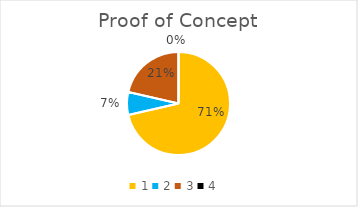
| Category | Series 0 |
|---|---|
| 0 | 0.714 |
| 1 | 0.071 |
| 2 | 0.214 |
| 3 | 0 |